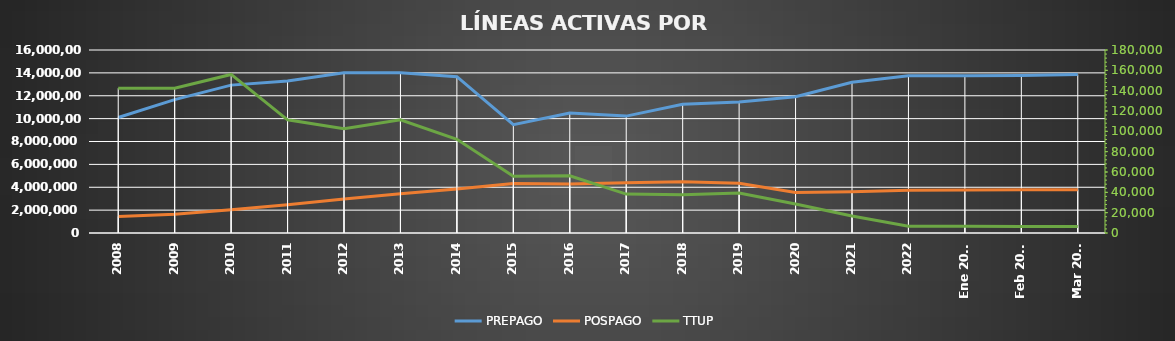
| Category | PREPAGO | POSPAGO |
|---|---|---|
| 2008 | 10097768 | 1452088 |
| 2009 | 11662294 | 1649838 |
| 2010 | 12929040 | 2033814 |
| 2011 | 13295834 | 2467378 |
| 2012 | 14008104 | 2976194 |
| 2013 | 14005126 | 3425277 |
| 2014 | 13666071 | 3846271 |
| 2015 | 9476240 | 4326937 |
| 2016 | 10498467 | 4293426 |
| 2017 | 10219457 | 4393703 |
| 2018 | 11254168 | 4480975 |
| 2019 | 11462048 | 4351686 |
| 2020 | 11917697 | 3539192 |
| 2021 | 13174530 | 3598383 |
| 2022 | 13740159 | 3743849 |
| Ene 2023 | 13744592 | 3762200 |
| Feb 2023 | 13771967 | 3773530 |
| Mar 2023 | 13859395 | 3786936 |